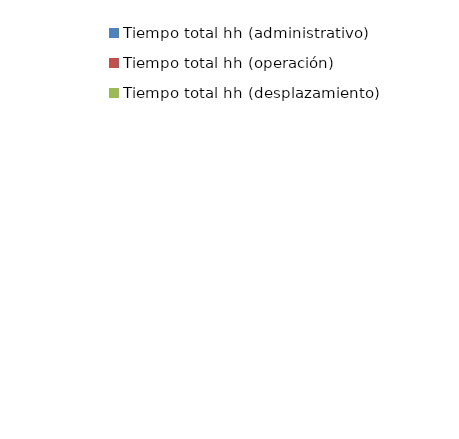
| Category | Series 0 |
|---|---|
| Tiempo total hh (administrativo) | 0 |
| Tiempo total hh (operación) | 0 |
| Tiempo total hh (desplazamiento) | 0 |